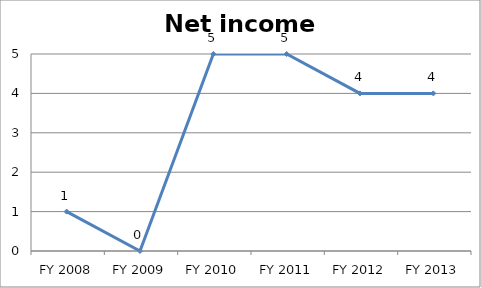
| Category | Net income score |
|---|---|
| FY 2013 | 4 |
| FY 2012 | 4 |
| FY 2011 | 5 |
| FY 2010 | 5 |
| FY 2009 | 0 |
| FY 2008 | 1 |